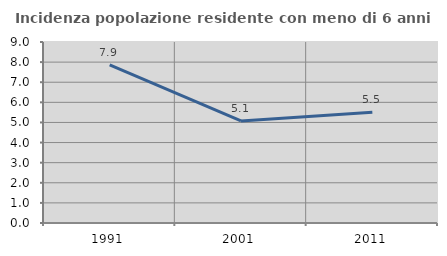
| Category | Incidenza popolazione residente con meno di 6 anni |
|---|---|
| 1991.0 | 7.86 |
| 2001.0 | 5.073 |
| 2011.0 | 5.502 |